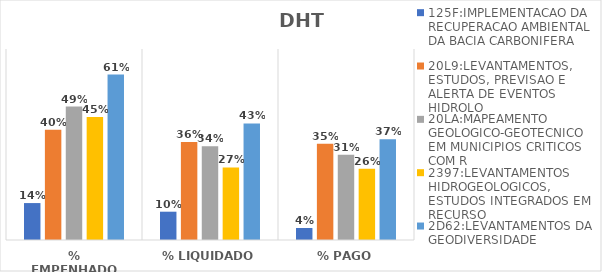
| Category | 125F:IMPLEMENTACAO DA RECUPERACAO AMBIENTAL DA BACIA CARBONIFERA | 20L9:LEVANTAMENTOS, ESTUDOS, PREVISAO E ALERTA DE EVENTOS HIDROLO | 20LA:MAPEAMENTO GEOLOGICO-GEOTECNICO EM MUNICIPIOS CRITICOS COM R | 2397:LEVANTAMENTOS HIDROGEOLOGICOS, ESTUDOS INTEGRADOS EM RECURSO | 2D62:LEVANTAMENTOS DA GEODIVERSIDADE |
|---|---|---|---|---|---|
| % EMPENHADO | 0.135 | 0.404 | 0.489 | 0.45 | 0.606 |
| % LIQUIDADO | 0.104 | 0.359 | 0.343 | 0.266 | 0.427 |
| % PAGO | 0.044 | 0.353 | 0.313 | 0.261 | 0.369 |